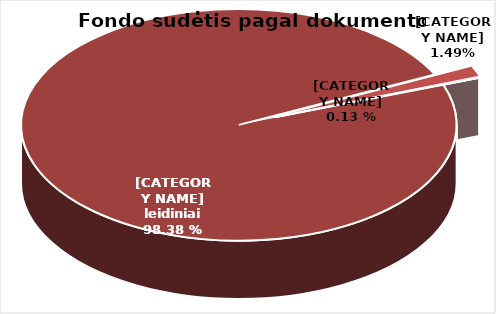
| Category | Series 0 |
|---|---|
| Knygos ir serialiniai | 1864243 |
| Garsiniai ir regimieji | 27785 |
| Kiti dokumentai | 2591 |